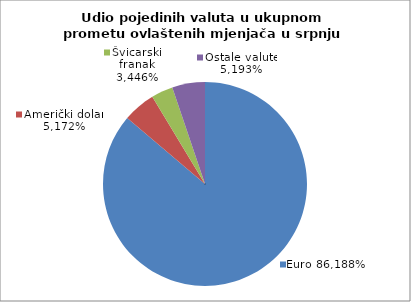
| Category | EUR |
|---|---|
| 0 | 0.862 |
| 1 | 0.052 |
| 2 | 0.034 |
| 3 | 0.052 |